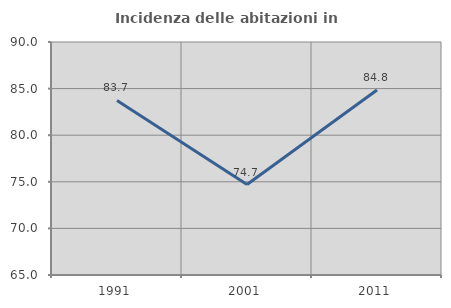
| Category | Incidenza delle abitazioni in proprietà  |
|---|---|
| 1991.0 | 83.735 |
| 2001.0 | 74.706 |
| 2011.0 | 84.848 |